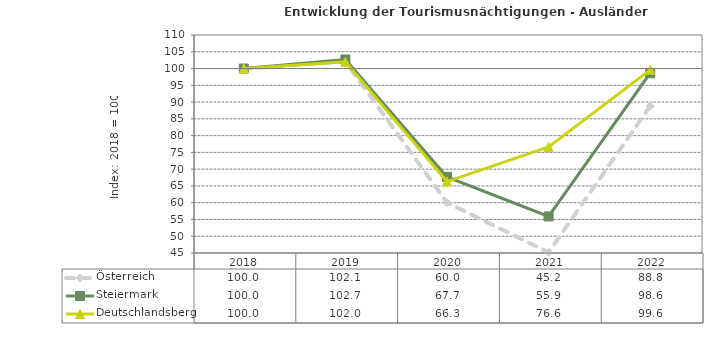
| Category | Österreich | Steiermark | Deutschlandsberg |
|---|---|---|---|
| 2022.0 | 88.8 | 98.6 | 99.6 |
| 2021.0 | 45.2 | 55.9 | 76.6 |
| 2020.0 | 60 | 67.7 | 66.3 |
| 2019.0 | 102.1 | 102.7 | 102 |
| 2018.0 | 100 | 100 | 100 |